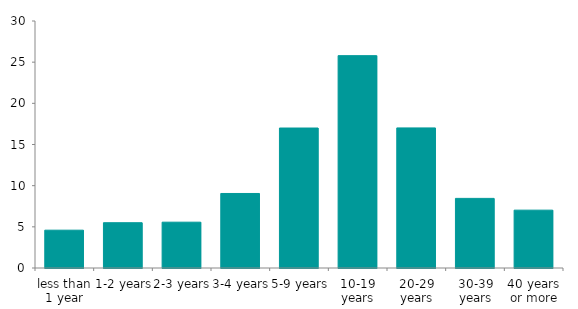
| Category | social renters |
|---|---|
| less than 1 year | 4.593 |
| 1-2 years | 5.501 |
| 2-3 years | 5.566 |
| 3-4 years | 9.051 |
| 5-9 years | 17.002 |
| 10-19 years | 25.792 |
| 20-29 years | 17.014 |
| 30-39 years | 8.455 |
| 40 years or more | 7.026 |